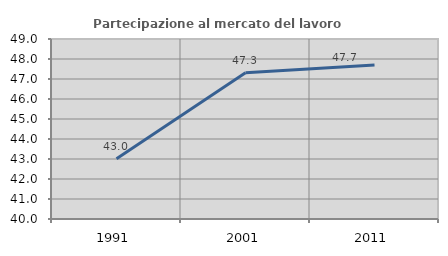
| Category | Partecipazione al mercato del lavoro  femminile |
|---|---|
| 1991.0 | 43.009 |
| 2001.0 | 47.318 |
| 2011.0 | 47.702 |